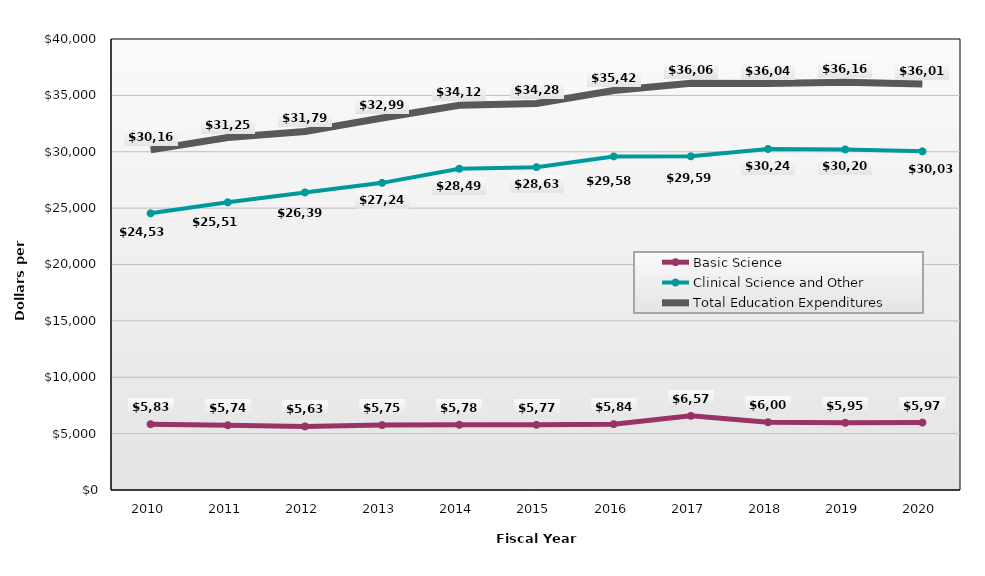
| Category | Basic Science | Clinical Science and Other | Total Education Expenditures |
|---|---|---|---|
| 2010.0 | 5833 | 24538 | 30165 |
| 2011.0 | 5741 | 25514 | 31255 |
| 2012.0 | 5637 | 26392 | 31799 |
| 2013.0 | 5756 | 27241 | 32997 |
| 2014.0 | 5787 | 28493 | 34121 |
| 2015.0 | 5778 | 28636 | 34288 |
| 2016.0 | 5841 | 29586 | 35426 |
| 2017.0 | 6575 | 29598 | 36066 |
| 2018.0 | 6007 | 30247 | 36044 |
| 2019.0 | 5959 | 30204 | 36162 |
| 2020.0 | 5977 | 30034 | 36011 |